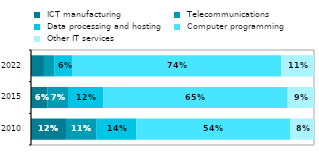
| Category |  ICT manufacturing |  Telecommunications |  Data processing and hosting |  Computer programming |  Other IT services  |
|---|---|---|---|---|---|
| 2010.0 | 0.124 | 0.108 | 0.141 | 0.544 | 0.083 |
| 2015.0 | 0.058 | 0.073 | 0.125 | 0.652 | 0.093 |
| 2022.0 | 0.046 | 0.036 | 0.063 | 0.74 | 0.115 |